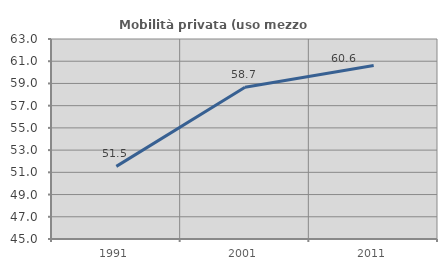
| Category | Mobilità privata (uso mezzo privato) |
|---|---|
| 1991.0 | 51.536 |
| 2001.0 | 58.661 |
| 2011.0 | 60.619 |